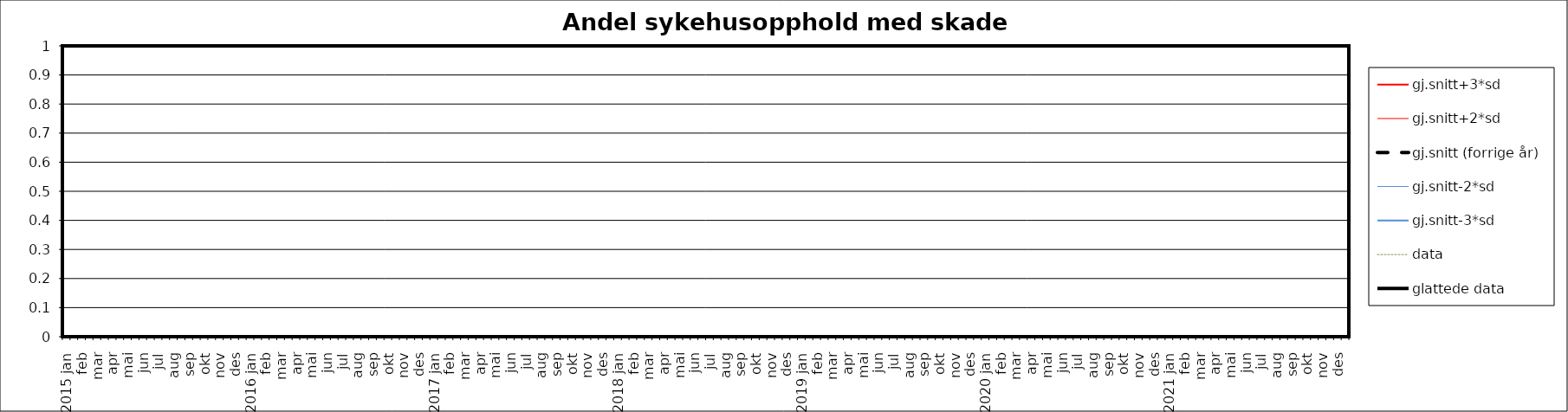
| Category | gj.snitt+3*sd | gj.snitt+2*sd | gj.snitt (forrige år) | gj.snitt-2*sd | gj.snitt-3*sd | data | glattede data |
|---|---|---|---|---|---|---|---|
| 2015 jan | 0 | 0 | 0 | 0 | 0 | 0 | 0 |
|  | 0 | 0 | 0 | 0 | 0 | 0 | 0 |
| feb | 0 | 0 | 0 | 0 | 0 | 0 | 0 |
|  | 0 | 0 | 0 | 0 | 0 | 0 | 0 |
| mar | 0 | 0 | 0 | 0 | 0 | 0 | 0 |
|  | 0 | 0 | 0 | 0 | 0 | 0 | 0 |
| apr | 0 | 0 | 0 | 0 | 0 | 0 | 0 |
|  | 0 | 0 | 0 | 0 | 0 | 0 | 0 |
| mai | 0 | 0 | 0 | 0 | 0 | 0 | 0 |
|  | 0 | 0 | 0 | 0 | 0 | 0 | 0 |
| jun | 0 | 0 | 0 | 0 | 0 | 0 | 0 |
|  | 0 | 0 | 0 | 0 | 0 | 0 | 0 |
| jul | 0 | 0 | 0 | 0 | 0 | 0 | 0 |
|  | 0 | 0 | 0 | 0 | 0 | 0 | 0 |
| aug | 0 | 0 | 0 | 0 | 0 | 0 | 0 |
|  | 0 | 0 | 0 | 0 | 0 | 0 | 0 |
| sep | 0 | 0 | 0 | 0 | 0 | 0 | 0 |
|  | 0 | 0 | 0 | 0 | 0 | 0 | 0 |
| okt | 0 | 0 | 0 | 0 | 0 | 0 | 0 |
|  | 0 | 0 | 0 | 0 | 0 | 0 | 0 |
| nov | 0 | 0 | 0 | 0 | 0 | 0 | 0 |
|  | 0 | 0 | 0 | 0 | 0 | 0 | 0 |
| des | 0 | 0 | 0 | 0 | 0 | 0 | 0 |
|  | 0 | 0 | 0 | 0 | 0 | 0 | 0 |
| 2016 jan | 0 | 0 | 0 | 0 | 0 | 0 | 0 |
|  | 0 | 0 | 0 | 0 | 0 | 0 | 0 |
| feb | 0 | 0 | 0 | 0 | 0 | 0 | 0 |
|  | 0 | 0 | 0 | 0 | 0 | 0 | 0 |
| mar | 0 | 0 | 0 | 0 | 0 | 0 | 0 |
|  | 0 | 0 | 0 | 0 | 0 | 0 | 0 |
| apr | 0 | 0 | 0 | 0 | 0 | 0 | 0 |
|  | 0 | 0 | 0 | 0 | 0 | 0 | 0 |
| mai | 0 | 0 | 0 | 0 | 0 | 0 | 0 |
|  | 0 | 0 | 0 | 0 | 0 | 0 | 0 |
| jun | 0 | 0 | 0 | 0 | 0 | 0 | 0 |
|  | 0 | 0 | 0 | 0 | 0 | 0 | 0 |
| jul | 0 | 0 | 0 | 0 | 0 | 0 | 0 |
|  | 0 | 0 | 0 | 0 | 0 | 0 | 0 |
| aug | 0 | 0 | 0 | 0 | 0 | 0 | 0 |
|  | 0 | 0 | 0 | 0 | 0 | 0 | 0 |
| sep | 0 | 0 | 0 | 0 | 0 | 0 | 0 |
|  | 0 | 0 | 0 | 0 | 0 | 0 | 0 |
| okt | 0 | 0 | 0 | 0 | 0 | 0 | 0 |
|  | 0 | 0 | 0 | 0 | 0 | 0 | 0 |
| nov | 0 | 0 | 0 | 0 | 0 | 0 | 0 |
|  | 0 | 0 | 0 | 0 | 0 | 0 | 0 |
| des | 0 | 0 | 0 | 0 | 0 | 0 | 0 |
|  | 0 | 0 | 0 | 0 | 0 | 0 | 0 |
| 2017 jan | 0 | 0 | 0 | 0 | 0 | 0 | 0 |
|  | 0 | 0 | 0 | 0 | 0 | 0 | 0 |
| feb | 0 | 0 | 0 | 0 | 0 | 0 | 0 |
|  | 0 | 0 | 0 | 0 | 0 | 0 | 0 |
| mar | 0 | 0 | 0 | 0 | 0 | 0 | 0 |
|  | 0 | 0 | 0 | 0 | 0 | 0 | 0 |
| apr | 0 | 0 | 0 | 0 | 0 | 0 | 0 |
|  | 0 | 0 | 0 | 0 | 0 | 0 | 0 |
| mai | 0 | 0 | 0 | 0 | 0 | 0 | 0 |
|  | 0 | 0 | 0 | 0 | 0 | 0 | 0 |
| jun | 0 | 0 | 0 | 0 | 0 | 0 | 0 |
|  | 0 | 0 | 0 | 0 | 0 | 0 | 0 |
| jul | 0 | 0 | 0 | 0 | 0 | 0 | 0 |
|  | 0 | 0 | 0 | 0 | 0 | 0 | 0 |
| aug | 0 | 0 | 0 | 0 | 0 | 0 | 0 |
|  | 0 | 0 | 0 | 0 | 0 | 0 | 0 |
| sep | 0 | 0 | 0 | 0 | 0 | 0 | 0 |
|  | 0 | 0 | 0 | 0 | 0 | 0 | 0 |
| okt | 0 | 0 | 0 | 0 | 0 | 0 | 0 |
|  | 0 | 0 | 0 | 0 | 0 | 0 | 0 |
| nov | 0 | 0 | 0 | 0 | 0 | 0 | 0 |
|  | 0 | 0 | 0 | 0 | 0 | 0 | 0 |
| des | 0 | 0 | 0 | 0 | 0 | 0 | 0 |
|  | 0 | 0 | 0 | 0 | 0 | 0 | 0 |
| 2018 jan | 0 | 0 | 0 | 0 | 0 | 0 | 0 |
|  | 0 | 0 | 0 | 0 | 0 | 0 | 0 |
| feb | 0 | 0 | 0 | 0 | 0 | 0 | 0 |
|  | 0 | 0 | 0 | 0 | 0 | 0 | 0 |
| mar | 0 | 0 | 0 | 0 | 0 | 0 | 0 |
|  | 0 | 0 | 0 | 0 | 0 | 0 | 0 |
| apr | 0 | 0 | 0 | 0 | 0 | 0 | 0 |
|  | 0 | 0 | 0 | 0 | 0 | 0 | 0 |
| mai | 0 | 0 | 0 | 0 | 0 | 0 | 0 |
|  | 0 | 0 | 0 | 0 | 0 | 0 | 0 |
| jun | 0 | 0 | 0 | 0 | 0 | 0 | 0 |
|  | 0 | 0 | 0 | 0 | 0 | 0 | 0 |
| jul | 0 | 0 | 0 | 0 | 0 | 0 | 0 |
|  | 0 | 0 | 0 | 0 | 0 | 0 | 0 |
| aug | 0 | 0 | 0 | 0 | 0 | 0 | 0 |
|  | 0 | 0 | 0 | 0 | 0 | 0 | 0 |
| sep | 0 | 0 | 0 | 0 | 0 | 0 | 0 |
|  | 0 | 0 | 0 | 0 | 0 | 0 | 0 |
| okt | 0 | 0 | 0 | 0 | 0 | 0 | 0 |
|  | 0 | 0 | 0 | 0 | 0 | 0 | 0 |
| nov | 0 | 0 | 0 | 0 | 0 | 0 | 0 |
|  | 0 | 0 | 0 | 0 | 0 | 0 | 0 |
| des | 0 | 0 | 0 | 0 | 0 | 0 | 0 |
|  | 0 | 0 | 0 | 0 | 0 | 0 | 0 |
| 2019 jan | 0 | 0 | 0 | 0 | 0 | 0 | 0 |
|  | 0 | 0 | 0 | 0 | 0 | 0 | 0 |
| feb | 0 | 0 | 0 | 0 | 0 | 0 | 0 |
|  | 0 | 0 | 0 | 0 | 0 | 0 | 0 |
| mar | 0 | 0 | 0 | 0 | 0 | 0 | 0 |
|  | 0 | 0 | 0 | 0 | 0 | 0 | 0 |
| apr | 0 | 0 | 0 | 0 | 0 | 0 | 0 |
|  | 0 | 0 | 0 | 0 | 0 | 0 | 0 |
| mai | 0 | 0 | 0 | 0 | 0 | 0 | 0 |
|  | 0 | 0 | 0 | 0 | 0 | 0 | 0 |
| jun | 0 | 0 | 0 | 0 | 0 | 0 | 0 |
|  | 0 | 0 | 0 | 0 | 0 | 0 | 0 |
| jul | 0 | 0 | 0 | 0 | 0 | 0 | 0 |
|  | 0 | 0 | 0 | 0 | 0 | 0 | 0 |
| aug | 0 | 0 | 0 | 0 | 0 | 0 | 0 |
|  | 0 | 0 | 0 | 0 | 0 | 0 | 0 |
| sep | 0 | 0 | 0 | 0 | 0 | 0 | 0 |
|  | 0 | 0 | 0 | 0 | 0 | 0 | 0 |
| okt | 0 | 0 | 0 | 0 | 0 | 0 | 0 |
|  | 0 | 0 | 0 | 0 | 0 | 0 | 0 |
| nov | 0 | 0 | 0 | 0 | 0 | 0 | 0 |
|  | 0 | 0 | 0 | 0 | 0 | 0 | 0 |
| des | 0 | 0 | 0 | 0 | 0 | 0 | 0 |
|  | 0 | 0 | 0 | 0 | 0 | 0 | 0 |
| 2020 jan | 0 | 0 | 0 | 0 | 0 | 0 | 0 |
|  | 0 | 0 | 0 | 0 | 0 | 0 | 0 |
| feb | 0 | 0 | 0 | 0 | 0 | 0 | 0 |
|  | 0 | 0 | 0 | 0 | 0 | 0 | 0 |
| mar | 0 | 0 | 0 | 0 | 0 | 0 | 0 |
|  | 0 | 0 | 0 | 0 | 0 | 0 | 0 |
| apr | 0 | 0 | 0 | 0 | 0 | 0 | 0 |
|  | 0 | 0 | 0 | 0 | 0 | 0 | 0 |
| mai | 0 | 0 | 0 | 0 | 0 | 0 | 0 |
|  | 0 | 0 | 0 | 0 | 0 | 0 | 0 |
| jun | 0 | 0 | 0 | 0 | 0 | 0 | 0 |
|  | 0 | 0 | 0 | 0 | 0 | 0 | 0 |
| jul | 0 | 0 | 0 | 0 | 0 | 0 | 0 |
|  | 0 | 0 | 0 | 0 | 0 | 0 | 0 |
| aug | 0 | 0 | 0 | 0 | 0 | 0 | 0 |
|  | 0 | 0 | 0 | 0 | 0 | 0 | 0 |
| sep | 0 | 0 | 0 | 0 | 0 | 0 | 0 |
|  | 0 | 0 | 0 | 0 | 0 | 0 | 0 |
| okt | 0 | 0 | 0 | 0 | 0 | 0 | 0 |
|  | 0 | 0 | 0 | 0 | 0 | 0 | 0 |
| nov | 0 | 0 | 0 | 0 | 0 | 0 | 0 |
|  | 0 | 0 | 0 | 0 | 0 | 0 | 0 |
| des | 0 | 0 | 0 | 0 | 0 | 0 | 0 |
|  | 0 | 0 | 0 | 0 | 0 | 0 | 0 |
| 2021 jan | 0 | 0 | 0 | 0 | 0 | 0 | 0 |
|  | 0 | 0 | 0 | 0 | 0 | 0 | 0 |
| feb | 0 | 0 | 0 | 0 | 0 | 0 | 0 |
|  | 0 | 0 | 0 | 0 | 0 | 0 | 0 |
| mar | 0 | 0 | 0 | 0 | 0 | 0 | 0 |
|  | 0 | 0 | 0 | 0 | 0 | 0 | 0 |
| apr | 0 | 0 | 0 | 0 | 0 | 0 | 0 |
|  | 0 | 0 | 0 | 0 | 0 | 0 | 0 |
| mai | 0 | 0 | 0 | 0 | 0 | 0 | 0 |
|  | 0 | 0 | 0 | 0 | 0 | 0 | 0 |
| jun | 0 | 0 | 0 | 0 | 0 | 0 | 0 |
|  | 0 | 0 | 0 | 0 | 0 | 0 | 0 |
| jul | 0 | 0 | 0 | 0 | 0 | 0 | 0 |
|  | 0 | 0 | 0 | 0 | 0 | 0 | 0 |
| aug | 0 | 0 | 0 | 0 | 0 | 0 | 0 |
|  | 0 | 0 | 0 | 0 | 0 | 0 | 0 |
| sep | 0 | 0 | 0 | 0 | 0 | 0 | 0 |
|  | 0 | 0 | 0 | 0 | 0 | 0 | 0 |
| okt | 0 | 0 | 0 | 0 | 0 | 0 | 0 |
|  | 0 | 0 | 0 | 0 | 0 | 0 | 0 |
| nov | 0 | 0 | 0 | 0 | 0 | 0 | 0 |
|  | 0 | 0 | 0 | 0 | 0 | 0 | 0 |
| des | 0 | 0 | 0 | 0 | 0 | 0 | 0 |